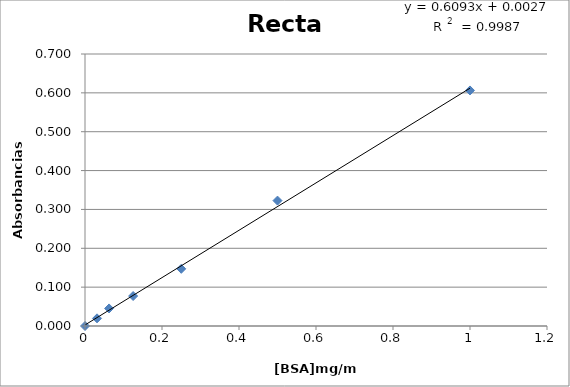
| Category | Series 0 |
|---|---|
| 1.0 | 0.606 |
| 0.5 | 0.323 |
| 0.25 | 0.147 |
| 0.125 | 0.077 |
| 0.0625 | 0.045 |
| 0.03125 | 0.02 |
| 0.0 | 0 |